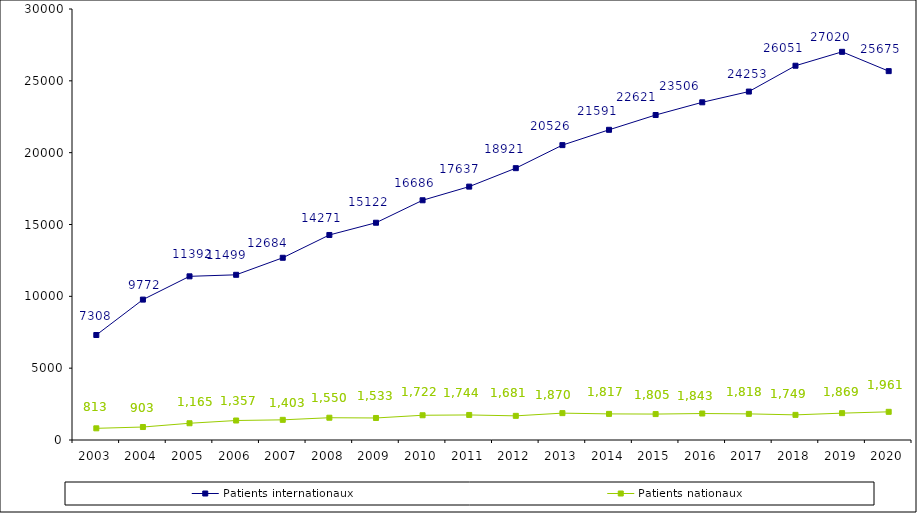
| Category | Patients internationaux | Patients nationaux |
|---|---|---|
| 2003.0 | 7308 | 813 |
| 2004.0 | 9772 | 903 |
| 2005.0 | 11392 | 1165 |
| 2006.0 | 11499 | 1357 |
| 2007.0 | 12684 | 1403 |
| 2008.0 | 14271 | 1550 |
| 2009.0 | 15122 | 1533 |
| 2010.0 | 16686 | 1722 |
| 2011.0 | 17637 | 1744 |
| 2012.0 | 18921 | 1681 |
| 2013.0 | 20526 | 1870 |
| 2014.0 | 21591 | 1817 |
| 2015.0 | 22621 | 1805 |
| 2016.0 | 23506 | 1843 |
| 2017.0 | 24253 | 1818 |
| 2018.0 | 26051 | 1749 |
| 2019.0 | 27020 | 1869 |
| 2020.0 | 25675 | 1961 |